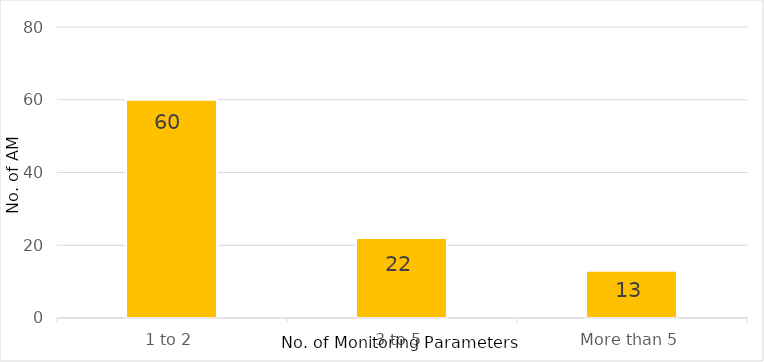
| Category | Series 0 |
|---|---|
| 0 | 60 |
| 1 | 22 |
| 2 | 13 |